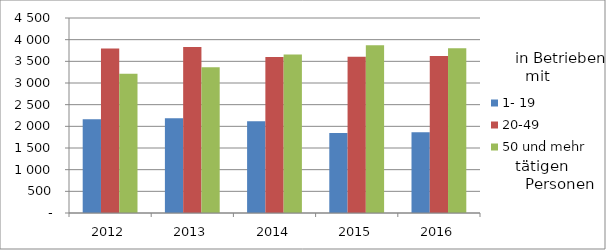
| Category | 1- 19 | 20-49 | 50 und mehr |
|---|---|---|---|
| 2012.0 | 2161 | 3794 | 3211 |
| 2013.0 | 2185 | 3829 | 3363 |
| 2014.0 | 2117 | 3601 | 3658 |
| 2015.0 | 1848 | 3603 | 3869 |
| 2016.0 | 1863 | 3623 | 3801 |